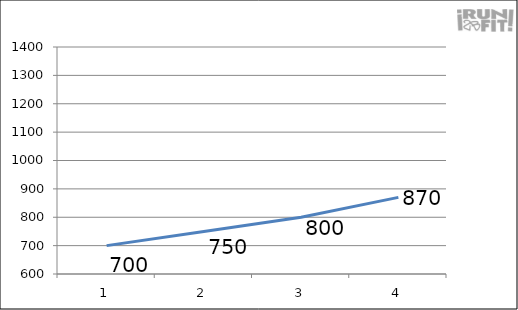
| Category | Series 0 |
|---|---|
| 0 | 700 |
| 1 | 750 |
| 2 | 800 |
| 3 | 870 |